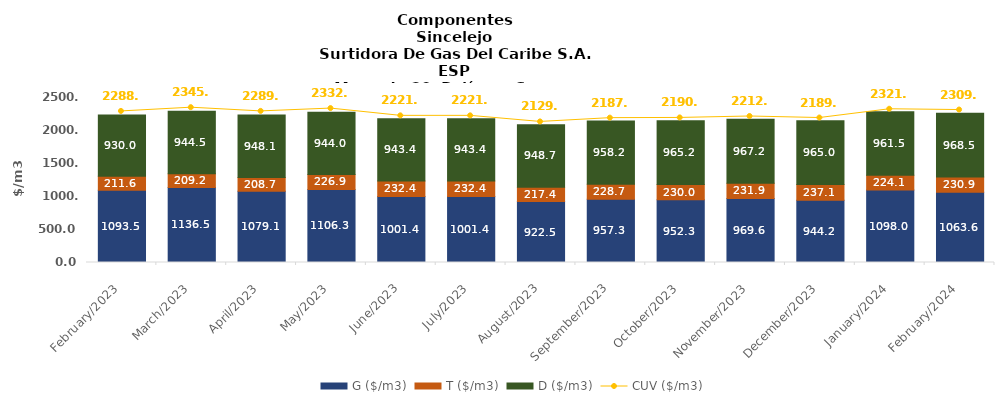
| Category | G ($/m3) | T ($/m3) | D ($/m3) |
|---|---|---|---|
| 2023-02-01 | 1093.5 | 211.55 | 930.03 |
| 2023-03-01 | 1136.5 | 209.16 | 944.52 |
| 2023-04-01 | 1079.14 | 208.7 | 948.13 |
| 2023-05-01 | 1106.33 | 226.94 | 944.03 |
| 2023-06-01 | 1001.4 | 232.37 | 943.37 |
| 2023-07-01 | 1001.4 | 232.37 | 943.37 |
| 2023-08-01 | 922.47 | 217.36 | 948.72 |
| 2023-09-01 | 957.29 | 228.69 | 958.18 |
| 2023-10-01 | 952.33 | 230.03 | 965.19 |
| 2023-11-01 | 969.64 | 231.88 | 967.17 |
| 2023-12-01 | 944.16 | 237.1 | 964.97 |
| 2024-01-01 | 1097.97 | 224.12 | 961.47 |
| 2024-02-01 | 1063.61 | 230.85 | 968.52 |